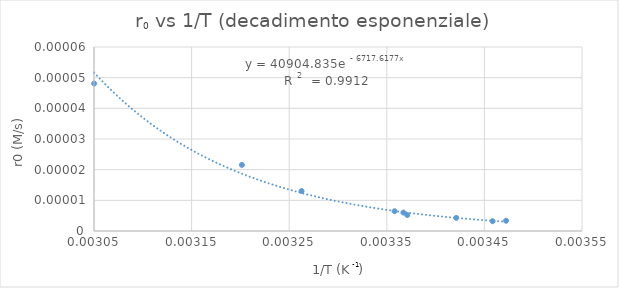
| Category | Series 0 |
|---|---|
| 0.003472222222222222 | 0 |
| 0.003458412588621823 | 0 |
| 0.003421142661648991 | 0 |
| 0.003370975897522333 | 0 |
| 0.003367003367003367 | 0 |
| 0.00335795836131632 | 0 |
| 0.0032626427406199023 | 0 |
| 0.0032015367376340646 | 0 |
| 0.0030501753850846426 | 0 |